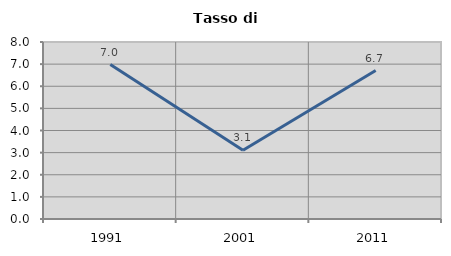
| Category | Tasso di disoccupazione   |
|---|---|
| 1991.0 | 6.982 |
| 2001.0 | 3.108 |
| 2011.0 | 6.709 |